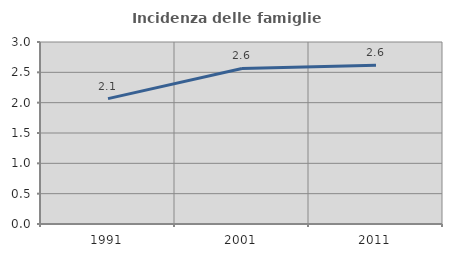
| Category | Incidenza delle famiglie numerose |
|---|---|
| 1991.0 | 2.067 |
| 2001.0 | 2.564 |
| 2011.0 | 2.616 |